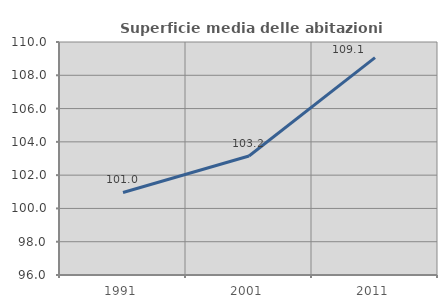
| Category | Superficie media delle abitazioni occupate |
|---|---|
| 1991.0 | 100.957 |
| 2001.0 | 103.15 |
| 2011.0 | 109.063 |